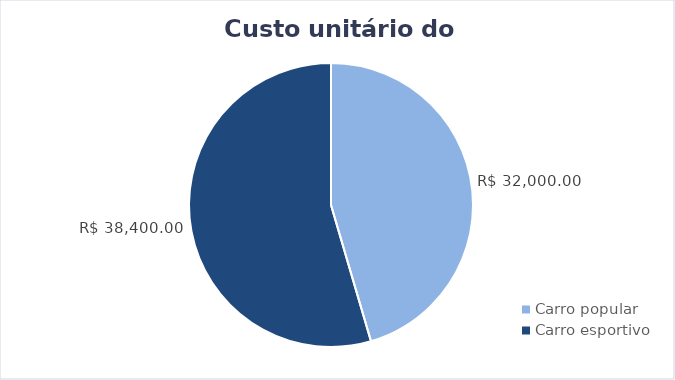
| Category | Series 0 |
|---|---|
| Carro popular | 32000 |
| Carro esportivo | 38400 |